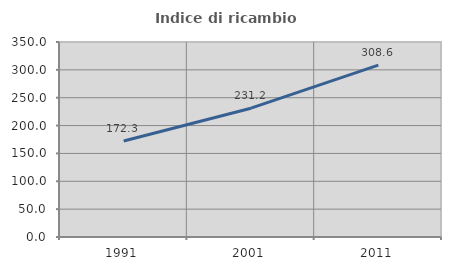
| Category | Indice di ricambio occupazionale  |
|---|---|
| 1991.0 | 172.308 |
| 2001.0 | 231.206 |
| 2011.0 | 308.553 |